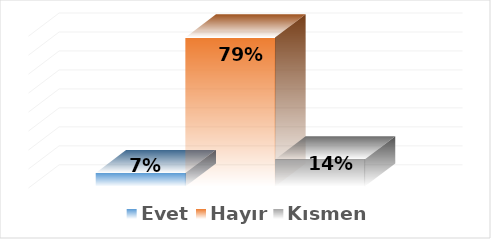
| Category | Evet | Hayır | Kısmen |
|---|---|---|---|
| 0 | 0.071 | 0.786 | 0.143 |